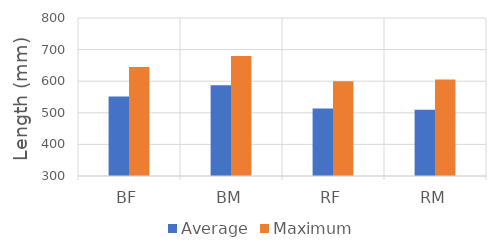
| Category | Average | Maximum |
|---|---|---|
| BF | 551.842 | 645 |
| BM | 587.5 | 680 |
| RF | 513.617 | 600 |
| RM | 509.333 | 605 |